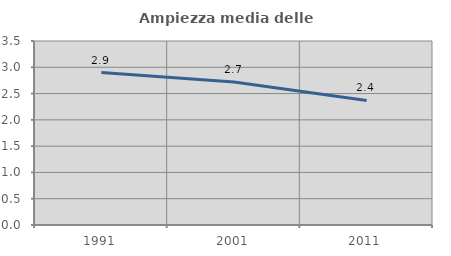
| Category | Ampiezza media delle famiglie |
|---|---|
| 1991.0 | 2.901 |
| 2001.0 | 2.721 |
| 2011.0 | 2.369 |